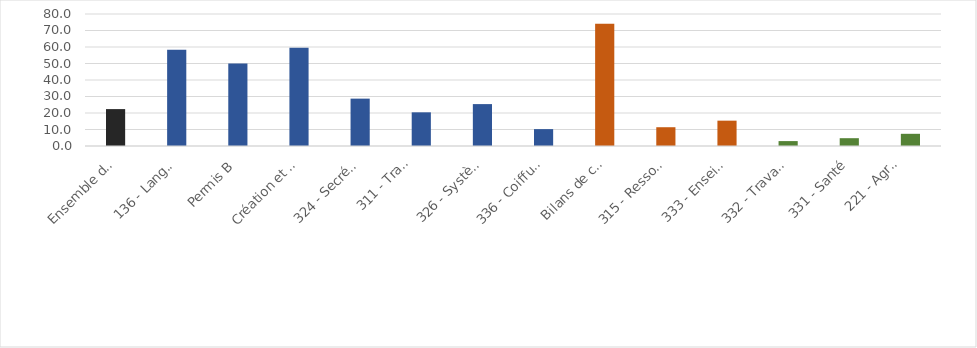
| Category | Prix horaire moyen en 2021 |
|---|---|
| Ensemble des formations | 22.362 |
| 136 - Langues vivantes | 58.302 |
| Permis B | 50.039 |
| Création et reprise d'entreprise | 59.544 |
| 324 - Secrétariat, bureautique | 28.709 |
| 311 - Transport (hors permis B),
manutention, magasinage | 20.414 |
| 326 - Systèmes d'information | 25.394 |
| 336 - Coiffure, esthétique | 10.237 |
| Bilans de compétences | 74.136 |
| 315 - Ressources humaines | 11.381 |
| 333 - Enseignement, formation | 15.357 |
| 332 - Travail social | 2.973 |
| 331 - Santé | 4.733 |
| 221 - Agroalimentaire,
alimentation, cuisine | 7.389 |